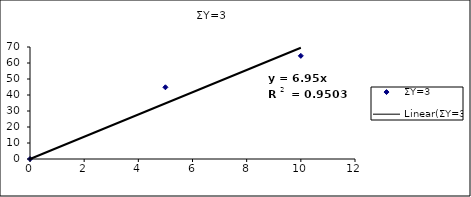
| Category | ΣΥ=3 |
|---|---|
| 0.0 | 0 |
| 5.0 | 44.821 |
| 10.0 | 64.464 |